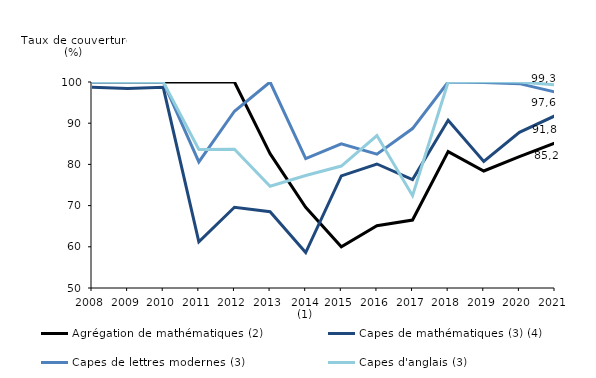
| Category | Agrégation de mathématiques (2) | Capes de mathématiques (3) (4) | Capes de lettres modernes (3) | Capes d'anglais (3) |
|---|---|---|---|---|
| 2008 | 100 | 98.7 | 100 | 100 |
| 2009 | 100 | 98.4 | 100 | 100 |
| 2010 | 100 | 98.7 | 100 | 100 |
| 2011 | 100 | 61.2 | 80.6 | 83.6 |
| 2012 | 100 | 69.6 | 92.9 | 83.7 |
| 2013 | 82.6 | 68.5 | 100 | 74.7 |
| 2014 (1) | 69.6 | 58.6 | 81.4 | 77.3 |
| 2015 | 60 | 77.2 | 85 | 79.6 |
| 2016 | 65.1 | 80.1 | 82.5 | 87 |
| 2017 | 66.5 | 76.3 | 88.7 | 72.4 |
| 2018 | 83.1 | 90.7 | 100 | 100 |
| 2019 | 78.4 | 80.7 | 99.9 | 100.1 |
| 2020 | 81.9 | 87.8 | 99.6 | 100 |
| 2021 | 85.2 | 91.8 | 97.586 | 99.327 |